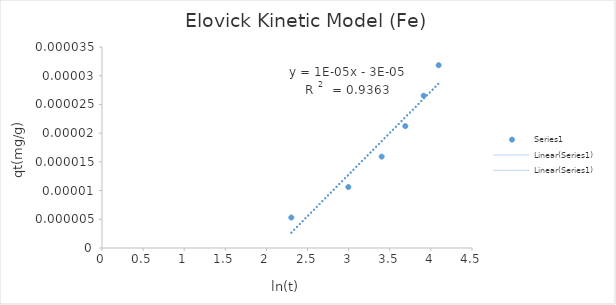
| Category | Series 0 |
|---|---|
| 2.302585092994046 | 0 |
| 2.995732273553991 | 0 |
| 3.4011973816621555 | 0 |
| 3.6888794541139363 | 0 |
| 3.912023005428146 | 0 |
| 4.0943445622221 | 0 |